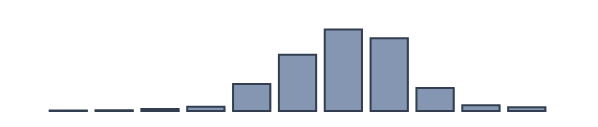
| Category | Series 0 |
|---|---|
| 0 | 0 |
| 1 | 0.217 |
| 2 | 0.261 |
| 3 | 0.739 |
| 4 | 1.565 |
| 5 | 9.696 |
| 6 | 20.261 |
| 7 | 29.391 |
| 8 | 26.174 |
| 9 | 8.261 |
| 10 | 2.043 |
| 11 | 1.391 |
| 12 | 0 |